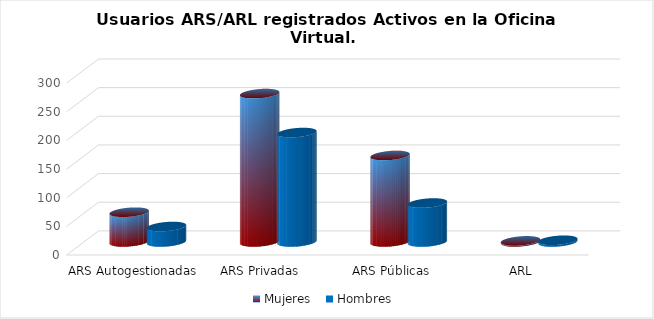
| Category | Mujeres | Hombres |
|---|---|---|
| ARS Autogestionadas | 52 | 27 |
| ARS Privadas | 259 | 191 |
| ARS Públicas | 151 | 68 |
| ARL | 2 | 3 |